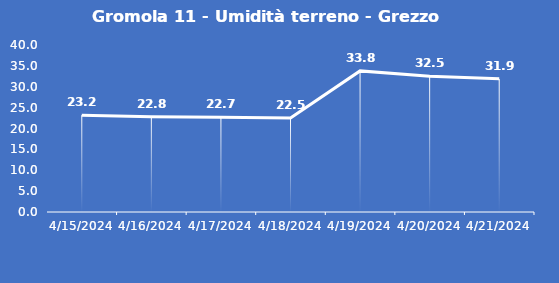
| Category | Gromola 11 - Umidità terreno - Grezzo (%VWC) |
|---|---|
| 4/15/24 | 23.2 |
| 4/16/24 | 22.8 |
| 4/17/24 | 22.7 |
| 4/18/24 | 22.5 |
| 4/19/24 | 33.8 |
| 4/20/24 | 32.5 |
| 4/21/24 | 31.9 |